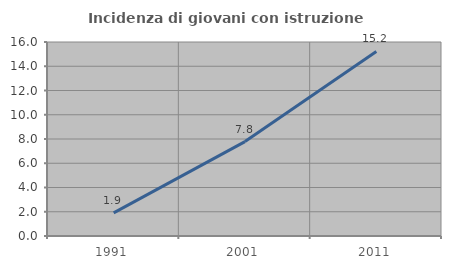
| Category | Incidenza di giovani con istruzione universitaria |
|---|---|
| 1991.0 | 1.908 |
| 2001.0 | 7.788 |
| 2011.0 | 15.217 |